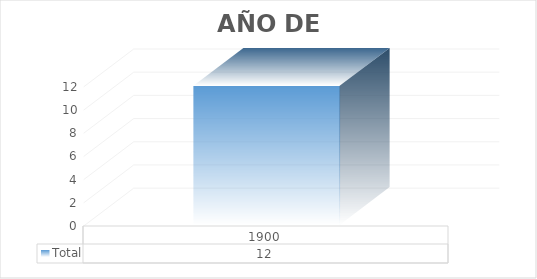
| Category | Total |
|---|---|
| 1900 | 12 |